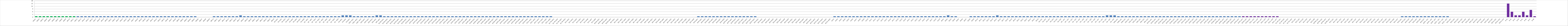
| Category | Series 0 |
|---|---|
| AW01 | 1 |
| AW02 | 1 |
| AW03 | 1 |
| AW04 | 1 |
| AW05 | 1 |
| AW06 | 1 |
| AW07 | 1 |
| AW08 | 1 |
| AW09 | 1 |
| AW10 | 1 |
| AW11 | 1 |
| AW12 | 1 |
| AW13 | 1 |
| AW14 | 1 |
| AW15 | 1 |
| AW16 | 1 |
| AW17 | 1 |
| AW18 | 1 |
| AW19 | 1 |
| AW20 | 1 |
| AW21 | 1 |
| AW22 | 1 |
| AW23 | 1 |
| AW24 | 1 |
| AW25 | 1 |
| AW26 | 1 |
| AW27 | 1 |
| AW28 | 1 |
| AW29 | 1 |
| AW30 | 1 |
| AW31 | 1 |
| AW32 | 1 |
| AW33 | 1 |
| AW34 | 1 |
| AW35 | 1 |
| AW36 | 1 |
| AW37 | 1 |
| AW38 | 1 |
| BW01 | 1 |
| BW02 | 1 |
| BW03 | 1 |
| BWO4 | 1 |
| BW05 | 1 |
| BW06 | 0 |
| BW07 | 0 |
| BW08 | 0 |
| BW09 | 0 |
| BW10 | 1 |
| BW11 | 1 |
| BW12 | 1 |
| BW13 | 1 |
| BW14 | 1 |
| BW15 | 1 |
| BW16 | 1 |
| BW17 | 2 |
| BW18 | 1 |
| BW19 | 1 |
| BW20 | 1 |
| BW21 | 1 |
| BW22 | 1 |
| BW23 | 1 |
| BW24 | 1 |
| BW25 | 1 |
| BW26 | 1 |
| OS.W01 | 1 |
| OS.W02 | 1 |
| OS.W03 | 1 |
| OS.W04 | 1 |
| OS.W05 | 1 |
| OS.W06 | 1 |
| OS.W07 | 1 |
| OS.W08 | 1 |
| OE. W01 | 1 |
| OE. W02 | 1 |
| OE. W03 | 1 |
| OE. W04 | 1 |
| OE. W05 | 1 |
| OE. W06 | 1 |
| OE. W07 | 1 |
| OE. W08 | 1 |
| OE. W09 | 1 |
| OA.W01 | 2 |
| OA.W02 | 2 |
| OA.W03 | 2 |
| OAN. W01 | 1 |
| OAN. W02 | 1 |
| OAN. W03 | 1 |
| OZŚ.W01 | 1 |
| OZŚ.W02 | 1 |
| OZŚ.W03 | 1 |
| OPE.W01 | 2 |
| OPE.W02 | 2 |
| B1OD.W01 | 1 |
| B1OD.W02 | 1 |
| B1OD.W03 | 1 |
| B1OD.W04 | 1 |
| B1OD.W05 | 1 |
| B1OD.W06 | 1 |
| B1OD.W07 | 1 |
| B1PZ.W01 | 1 |
| B1PZ.W02 | 1 |
| B1PZ.W03 | 1 |
| B1PZ.W04 | 1 |
| B1PZ.W05 | 1 |
| B1PZ.W06 | 1 |
| B1PZ.W07 | 1 |
| B1PZ.W08 | 1 |
| B1PS.W01 | 1 |
| B1PS.W02 | 1 |
| B1PS.W03 | 1 |
| B1PS.W04 | 1 |
| B1PS.W05 | 1 |
| B1PS.W06 | 1 |
| B1PS.W07 | 1 |
| B1PS.W08 | 1 |
| B1MŚ.W01 | 1 |
| B1MŚ.W02 | 1 |
| B1MŚ.W03 | 1 |
| B1MŚ.W04 | 1 |
| B1MŚ.W05 | 1 |
| B1MŚ.W06 | 1 |
| B1MŚ.W07 | 1 |
| B1MŚ.W08 | 1 |
| B1PO.W01 | 1 |
| B1PO.W02 | 1 |
| B1PO.W03 | 1 |
| B1PO.W04 | 1 |
| B1PO.W05 | 1 |
| B1PO.W06 | 1 |
| B1PO.W07 | 1 |
| B1PO.W08 | 1 |
| B1EL.W01 | 1 |
| B1EL.W02 | 1 |
| B1EL.W03 | 1 |
| B1EL.W04 | 1 |
| B1EL.W05 | 1 |
| B1EL.W06 | 1 |
| B1.PR.W01 | 0 |
| B1.PR.W02 | 0 |
| B1.PR.W03 | 0 |
| B1.PR.W04 | 0 |
| B1S.W01 | 0 |
| B1S.W02 | 0 |
| B1S.W03 | 0 |
| B1S.W04 | 0 |
| B1S.W05 | 0 |
| B1S.W06 | 0 |
| B1S.W07 | 0 |
| B1S.W08 | 0 |
| B2PW.W01 | 0 |
| B2PW.W02 | 0 |
| B2PW.W03 | 0 |
| B2PW.W04 | 0 |
| B2C.W01 | 0 |
| B2C.W02 | 0 |
| B2C.W03 | 0 |
| B2C.W04 | 0 |
| B2C.W05 | 0 |
| B2C.W06 | 0 |
| B2C.W07 | 0 |
| B2C.W08 | 0 |
| B2K.W01 | 0 |
| B2K.W02 | 0 |
| B2K.W03 | 0 |
| B2K.W04 | 0 |
| B2K.W05 | 0 |
| B2K.W06 | 0 |
| B2U.W01 | 0 |
| B2U.W02 | 0 |
| B2U.W03 | 0 |
| B2U.W04 | 0 |
| B2U.W05 | 0 |
| B2U.W06 | 0 |
| B2U.W07 | 0 |
| B2U.W08 | 0 |
| B2N.W01 | 1 |
| B2N.W02 | 1 |
| B2N.W03 | 1 |
| B2N.W04 | 1 |
| B2N.W05 | 1 |
| B2N.W06 | 1 |
| B2N.W07 | 1 |
| B2N.W08 | 1 |
| B2PP.W01 | 1 |
| B2PP.W02 | 1 |
| B2PP.W03 | 1 |
| B2ŻY.W01 | 1 |
| B2ŻY.W02 | 1 |
| B2ŻY.W03 | 1 |
| B2ŻY.W04 | 1 |
| B2ŻY.W05 | 1 |
| B2O.W01 | 0 |
| B2O.W02 | 0 |
| B2O.W03 | 0 |
| B2O.W04 | 0 |
| B2O.W05 | 0 |
| B2O.W06 | 0 |
| B2O.W07 | 0 |
| B2O.W08 | 0 |
| B2O.W09 | 0 |
| B2D.W01 | 0 |
| B2D.W02 | 0 |
| B2D.W03 | 0 |
| B2D.W04 | 0 |
| B2D.W05 | 0 |
| B2CH.W01 | 0 |
| B2CH.W02 | 0 |
| B2CH.W03 | 0 |
| B2CH.W04 | 0 |
| B2CH.W05 | 0 |
| B2CH.W06 | 0 |
| AU01 | 1 |
| AU02 | 1 |
| AU03 | 1 |
| AU04 | 1 |
| AU05 | 1 |
| AU06 | 1 |
| AU07 | 1 |
| AU08 | 1 |
| AU09 | 1 |
| AU10 | 1 |
| AU11 | 1 |
| AU12 | 1 |
| AU13 | 1 |
| AU14 | 1 |
| AU15 | 1 |
| AU16 | 1 |
| AU17 | 1 |
| AU18 | 1 |
| AU19 | 1 |
| AU20 | 1 |
| AU21 | 1 |
| AU22 | 1 |
| AU23 | 1 |
| AU24 | 1 |
| AU25 | 1 |
| AU26 | 1 |
| AU27 | 1 |
| AU28 | 1 |
| AU29 | 1 |
| BU01 | 1 |
| BU02 | 2 |
| BU03 | 1 |
| BU04 | 1 |
| BU05 | 0 |
| BU06 | 0 |
| BU07 | 0 |
| BU08 | 1 |
| BU09 | 1 |
| BU10 | 1 |
| BU11 | 1 |
| BU12 | 1 |
| BU13 | 1 |
| BU14 | 1 |
| BU15 | 2 |
| BU16 | 1 |
| BU17 | 1 |
| BU18 | 1 |
| BU19 | 1 |
| BU20 | 1 |
| BU21 | 1 |
| BU22 | 1 |
| BU23 | 1 |
| BU24 | 1 |
| BU25 | 1 |
| BU26 | 1 |
| OS.U01 | 1 |
| OS.U02 | 1 |
| OS.U03 | 1 |
| OS.U04 | 1 |
| OS.U05 | 1 |
| OS.U06 | 1 |
| OE. U01 | 1 |
| OE. U02 | 1 |
| OE. U03 | 1 |
| OE. U04 | 1 |
| OE. U05 | 1 |
| OE. U06 | 1 |
| OE. U07 | 1 |
| OE. U08 | 1 |
| OE. U09 | 1 |
| OA. U01 | 1 |
| OA. U02 | 1 |
| OA. U03 | 2 |
| OA. U04 | 2 |
| OA. U05 | 2 |
| OAN.U01 | 1 |
| OAN.U02 | 1 |
| OAN.U03 | 1 |
| OZŚ.U01 | 1 |
| OZŚ.U02 | 1 |
| OZŚ.U03 | 1 |
| OPE.U01 | 1 |
| OPE.U02 | 1 |
| OPE.U03 | 1 |
| B1OD.U01 | 1 |
| B1OD.U02 | 1 |
| B1OD.U03 | 1 |
| B1OD.U04 | 1 |
| B1OD.U05 | 1 |
| B1OD.U06 | 1 |
| B1OD.U07 | 1 |
| B1OD.U08 | 1 |
| B1PZ.U01 | 1 |
| B1PZ.U02 | 1 |
| B1PZ.U03 | 1 |
| B1PZ.U04 | 1 |
| B1PZ.U05 | 1 |
| B1PS.U01 | 1 |
| B1PS.U02 | 1 |
| B1PS.U03 | 1 |
| B1PS.U04 | 1 |
| B1MŚ.U01 | 1 |
| B1MŚ.U02 | 1 |
| B1MŚ.U03 | 1 |
| B1MŚ.U04 | 1 |
| B1MŚ.U05 | 1 |
| B1PO.U01 | 1 |
| B1PO.U02 | 1 |
| B1PO.U03 | 1 |
| B1PO.U04 | 1 |
| B1PO.U05 | 1 |
| B1EL.U01 | 1 |
| B1EL.U02 | 1 |
| B1EL.U03 | 1 |
| B1EL.U04 | 1 |
| B1EL.U05 | 1 |
| B1EL.U06 | 1 |
| B1EL.U07 | 1 |
| B1.RP.U01 | 0 |
| B1.RP.U02 | 0 |
| B1.RP.U03 | 0 |
| B1.RP.U04 | 0 |
| B2S.U01 | 0 |
| B2S.U02 | 0 |
| B2S.U03 | 0 |
| B2S.U04 | 0 |
| B2S.U05 | 0 |
| B2S.U06 | 0 |
| B2PW.U01 | 0 |
| B2PW.U02 | 0 |
| B2PW.U03 | 0 |
| B2PW.U04 | 0 |
| B2C.U01 | 0 |
| B2C.U02 | 0 |
| B2C.U03 | 0 |
| B2C.U04 | 0 |
| B2C.U05 | 0 |
| B2C.U06 | 0 |
| B2C.U07 | 0 |
| B2K.U01 | 0 |
| B2K.U02 | 0 |
| B2K.U03 | 0 |
| B2K.U04 | 0 |
| B2U.U01 | 0 |
| B2U.U02 | 0 |
| B2U.U03 | 0 |
| B2U.U04 | 0 |
| B2U.U05 | 0 |
| B2U.U06 | 0 |
| B2U.U07 | 0 |
| B2N.U01 | 1 |
| B2N.U02 | 1 |
| B2N.U03 | 1 |
| B2N.U04 | 1 |
| B2N.U05 | 1 |
| B2N.U06 | 1 |
| B2N.U07 | 1 |
| B2PP. U01 | 1 |
| B2PP. U02 | 1 |
| B2PP. U03 | 1 |
| B2ŻY. U01 | 1 |
| B2ŻY. U02 | 1 |
| B2ŻY. U03 | 1 |
| B2O.U01 | 0 |
| B2O.U02 | 0 |
| B2O.U03 | 0 |
| B2O.U04 | 0 |
| B2O.U05 | 0 |
| B2O.U06 | 0 |
| B2O.U07 | 0 |
| B2D.U01 | 0 |
| B2D.U02 | 0 |
| B2D.U03 | 0 |
| B2D.U04 | 0 |
| B2D.U05 | 0 |
| B2CH.U01 | 0 |
| B2CH.U02 | 0 |
| B2CH.U03 | 0 |
| B.K1 | 15 |
| B.K2 | 6 |
| B.K3 | 2 |
| B.K4 | 2 |
| B.K5 | 6 |
| B.K6 | 2 |
| B.K7 | 8 |
| B.K8 | 1 |